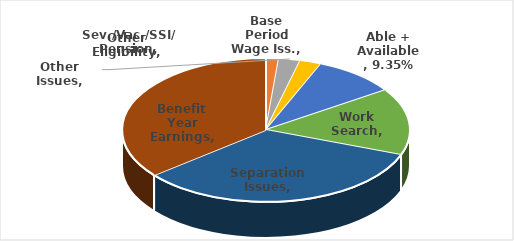
| Category | Series 0 |
|---|---|
| Base Period Wage Iss. | 0.001 |
| Sev./Vac./SSI/ Pension | 0.014 |
| Other Issues | 0.024 |
| Other Eligibility | 0.024 |
| Able + Available | 0.093 |
| Work Search | 0.15 |
| Separation Issues | 0.335 |
| Benefit Year Earnings | 0.358 |